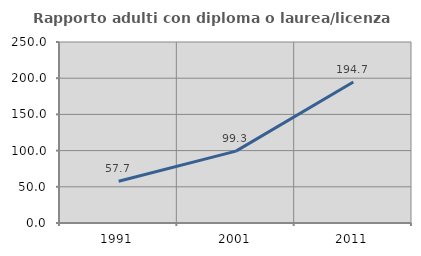
| Category | Rapporto adulti con diploma o laurea/licenza media  |
|---|---|
| 1991.0 | 57.657 |
| 2001.0 | 99.282 |
| 2011.0 | 194.725 |